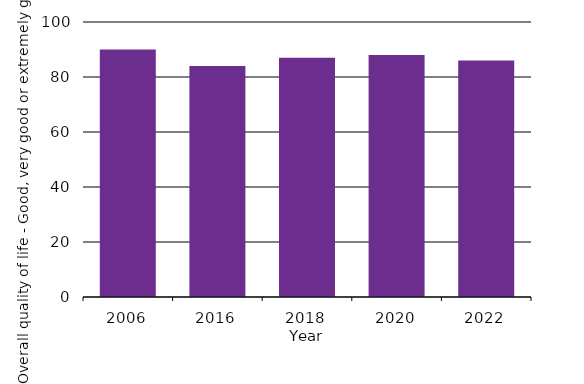
| Category | Overall quality of life - Good, very good or extremely good |
|---|---|
| 2006.0 | 90 |
| 2016.0 | 84 |
| 2018.0 | 87 |
| 2020.0 | 88 |
| 2022.0 | 86 |